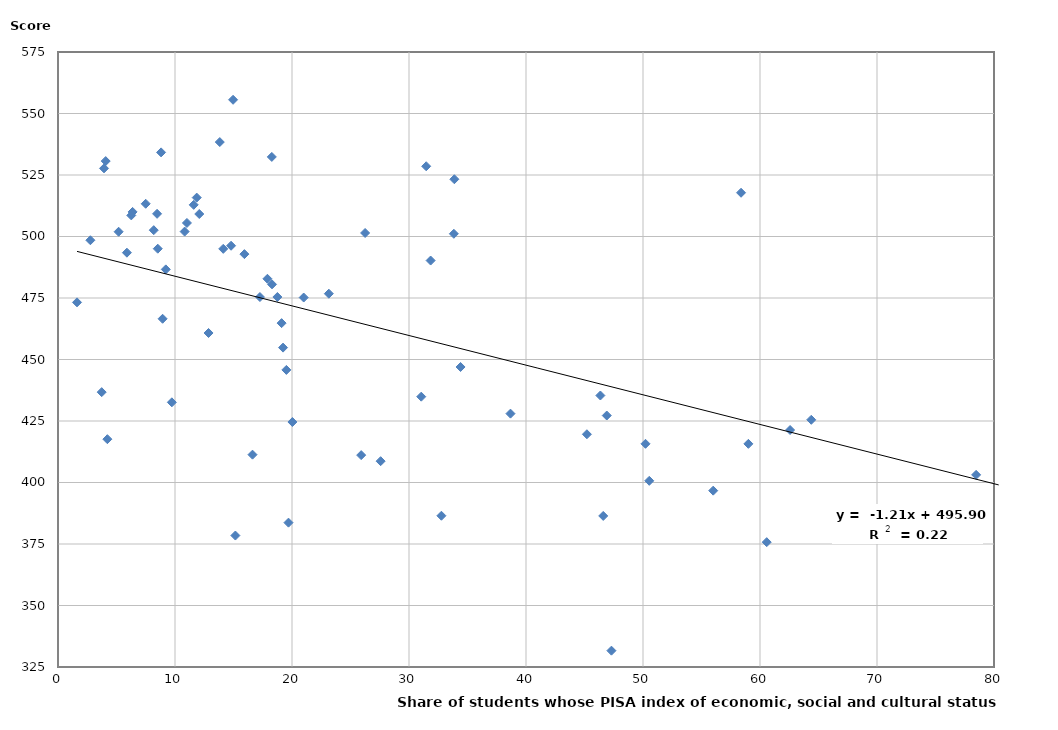
| Category | Share of students with a disadvantaged socio-economic background  |
|---|---|
| 46.90307 | 427.225 |
| 60.57487 | 375.745 |
| 6.37593 | 509.994 |
| 8.526023 | 495.038 |
| 10.82626 | 502 |
| 50.53502 | 400.682 |
| 58.37985 | 517.779 |
| 19.51893 | 445.772 |
| 21.00051 | 475.187 |
| 3.933518 | 527.705 |
| 34.40698 | 446.956 |
| 18.27482 | 532.348 |
| 50.21381 | 415.729 |
| 45.20441 | 419.608 |
| 17.2608 | 475.391 |
| 9.731522 | 432.596 |
| 15.93178 | 492.83 |
| 5.182379 | 501.937 |
| 47.302 | 331.639 |
| 8.811556 | 534.194 |
| 4.07668 | 530.661 |
| 14.12365 | 494.978 |
| 19.69975 | 383.682 |
| 25.91246 | 411.132 |
| 12.07371 | 509.141 |
| 19.23521 | 454.829 |
| 33.87679 | 523.277 |
| 23.14903 | 476.748 |
| 1.625969 | 473.23 |
| 78.47238 | 403.1 |
| 8.184189 | 502.575 |
| 8.940173 | 466.553 |
| 18.29307 | 480.547 |
| 13.82831 | 538.395 |
| 27.57534 | 408.669 |
| 11.85682 | 515.81 |
| 15.16051 | 378.442 |
| 31.84936 | 490.225 |
| 32.77028 | 386.485 |
| 18.7524 | 475.409 |
| 17.89993 | 482.806 |
| 31.47112 | 528.55 |
| 19.11203 | 464.782 |
| 59.00728 | 415.71 |
| 38.67358 | 427.998 |
| 16.62397 | 411.314 |
| 6.263681 | 508.575 |
| 7.496877 | 513.304 |
| 2.767914 | 498.481 |
| 56.00061 | 396.684 |
| 26.24887 | 501.435 |
| 33.8328 | 501.1 |
| 4.219368 | 417.611 |
| 31.04765 | 434.885 |
| 9.214284 | 486.631 |
| 14.96341 | 555.575 |
| 12.8663 | 460.775 |
| 11.599 | 512.864 |
| nan | 492.786 |
| 5.889801 | 493.422 |
| 11.02055 | 505.506 |
| 62.57186 | 421.337 |
| 20.03541 | 424.59 |
| 46.60114 | 386.403 |
| 64.38149 | 425.49 |
| 3.735148 | 436.731 |
| 8.467126 | 509.222 |
| 14.79177 | 496.242 |
| 46.35813 | 435.363 |
| 80.40253 | 524.644 |